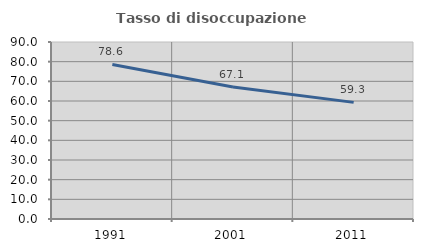
| Category | Tasso di disoccupazione giovanile  |
|---|---|
| 1991.0 | 78.571 |
| 2001.0 | 67.143 |
| 2011.0 | 59.302 |